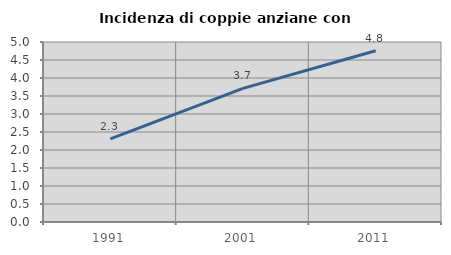
| Category | Incidenza di coppie anziane con figli |
|---|---|
| 1991.0 | 2.309 |
| 2001.0 | 3.712 |
| 2011.0 | 4.758 |